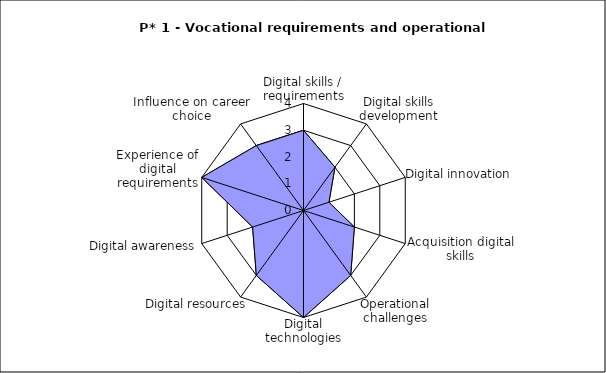
| Category | Series 1 | Series 0 |
|---|---|---|
| Digital skills / requirements | 3 | 3 |
| Digital skills development | 2 | 2 |
| Digital innovation | 1 | 1 |
| Acquisition digital skills | 2 | 2 |
| Operational challenges | 3 | 3 |
| Digital technologies | 4 | 4 |
| Digital resources | 3 | 3 |
| Digital awareness | 2 | 2 |
| Experience of digital requirements | 4 | 4 |
| Influence on career choice | 3 | 3 |